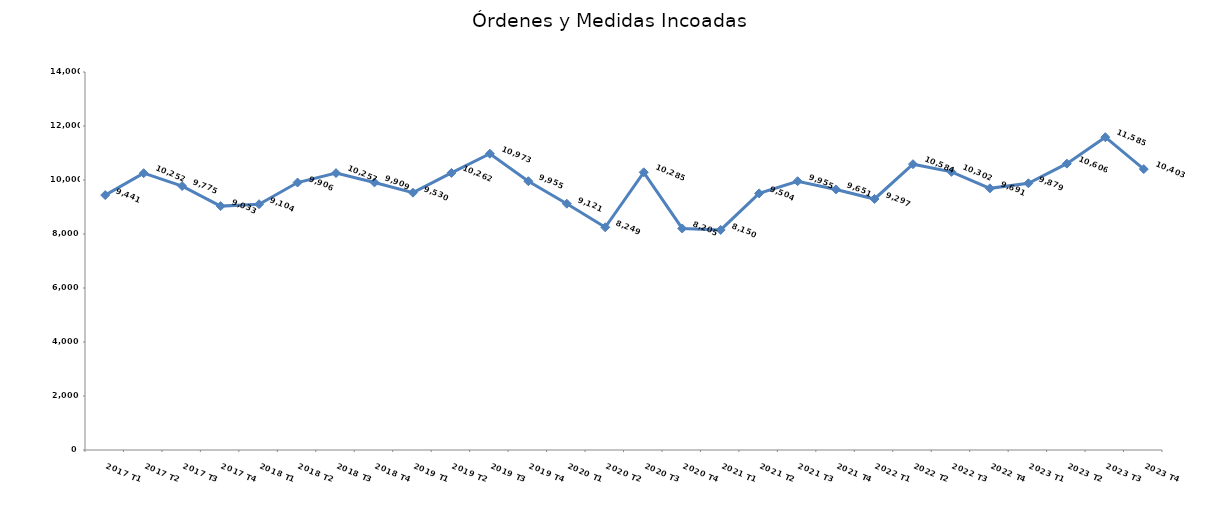
| Category | Órdenes y Medidas incoadas |
|---|---|
| 2017 T1 | 9441 |
| 2017 T2 | 10252 |
| 2017 T3 | 9775 |
| 2017 T4 | 9033 |
| 2018 T1 | 9104 |
| 2018 T2 | 9906 |
| 2018 T3 | 10257 |
| 2018 T4 | 9909 |
| 2019 T1 | 9530 |
| 2019 T2 | 10262 |
| 2019 T3 | 10973 |
| 2019 T4 | 9955 |
| 2020 T1 | 9121 |
| 2020 T2 | 8249 |
| 2020 T3 | 10285 |
| 2020 T4 | 8205 |
| 2021 T1 | 8150 |
| 2021 T2 | 9504 |
| 2021 T3 | 9955 |
| 2021 T4 | 9651 |
| 2022 T1 | 9297 |
| 2022 T2 | 10584 |
| 2022 T3 | 10302 |
| 2022 T4 | 9691 |
| 2023 T1 | 9879 |
| 2023 T2 | 10606 |
| 2023 T3 | 11585 |
| 2023 T4 | 10403 |